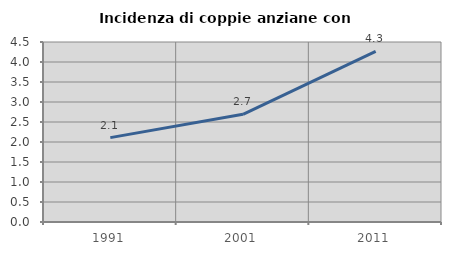
| Category | Incidenza di coppie anziane con figli |
|---|---|
| 1991.0 | 2.11 |
| 2001.0 | 2.692 |
| 2011.0 | 4.264 |